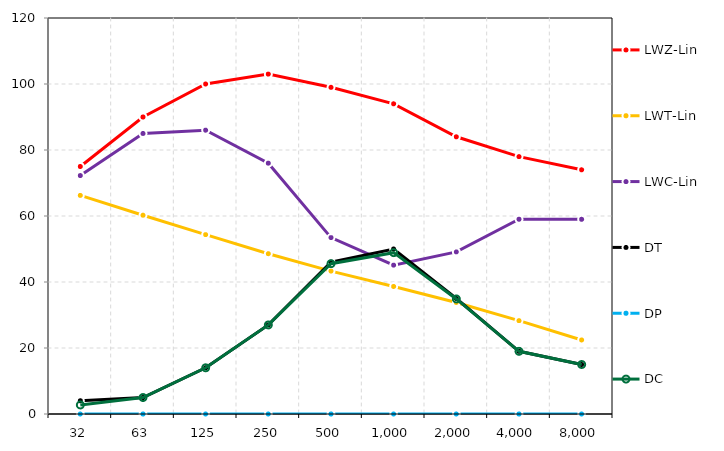
| Category | LWZ-Lin | LWT-Lin | LWC-Lin | DT | DP | DC |
|---|---|---|---|---|---|---|
| 31.5 | 75 | 66.244 | 72.253 | 4 | 0 | 2.747 |
| 63.0 | 90 | 60.241 | 85.014 | 5 | 0 | 4.986 |
| 125.0 | 100 | 54.356 | 86.003 | 14 | 0 | 13.997 |
| 250.0 | 103 | 48.58 | 76.008 | 27 | 0 | 26.992 |
| 500.0 | 99 | 43.299 | 53.442 | 46 | 0 | 45.558 |
| 1000.0 | 94 | 38.642 | 45.11 | 50 | 0 | 48.89 |
| 2000.0 | 84 | 33.803 | 49.129 | 35 | 0 | 34.871 |
| 4000.0 | 78 | 28.297 | 59.004 | 19 | 0 | 18.996 |
| 8000.0 | 74 | 22.43 | 59.001 | 15 | 0 | 14.999 |